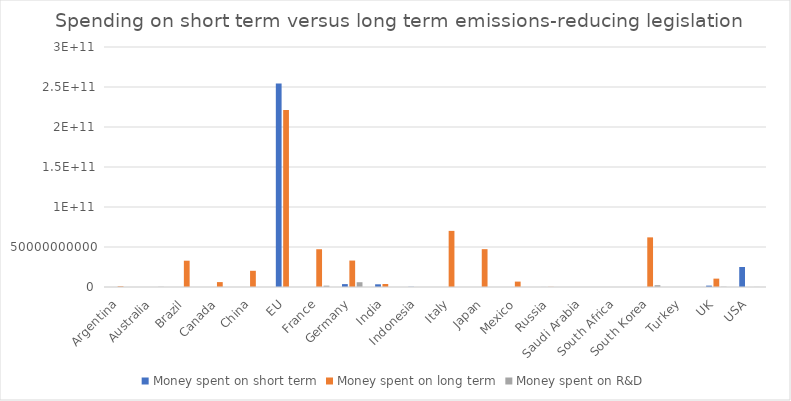
| Category | Money spent on short term | Money spent on long term | Money spent on R&D |
|---|---|---|---|
| Argentina | 0 | 840216000 | 0 |
| Australia | 0 | 0 | 260100000 |
| Brazil | 0 | 32875700000 | 0 |
| Canada | 0 | 6127500000 | 0 |
| China | 0 | 20258000000 | 0 |
| EU | 254250000000 | 221130000000 | 0 |
| France | 0 | 47208500000 | 1700650000 |
| Germany | 3616000000 | 33059500000 | 5989000000 |
| India | 3380000000 | 3718000000 | 0 |
| Indonesia | 251340000 | 0 | 0 |
| Italy | 0 | 70144900000 | 0 |
| Japan | 0 | 47295750000 | 0 |
| Mexico | 0 | 6747360135.14 | 0 |
| Russia | 45360000 | 185178000 | 0 |
| Saudi Arabia | 0 | 0 | 0 |
| South Africa | 0 | 0 | 0 |
| South Korea | 0 | 62043222100 | 2241000000 |
| Turkey | 0 | 0 | 0 |
| UK | 1722500000 | 10466500000 | 312965000 |
| USA | 25000000000 | 0 | 100000000 |